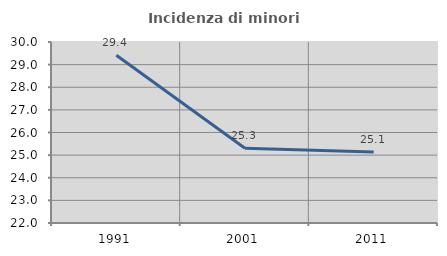
| Category | Incidenza di minori stranieri |
|---|---|
| 1991.0 | 29.412 |
| 2001.0 | 25.301 |
| 2011.0 | 25.135 |